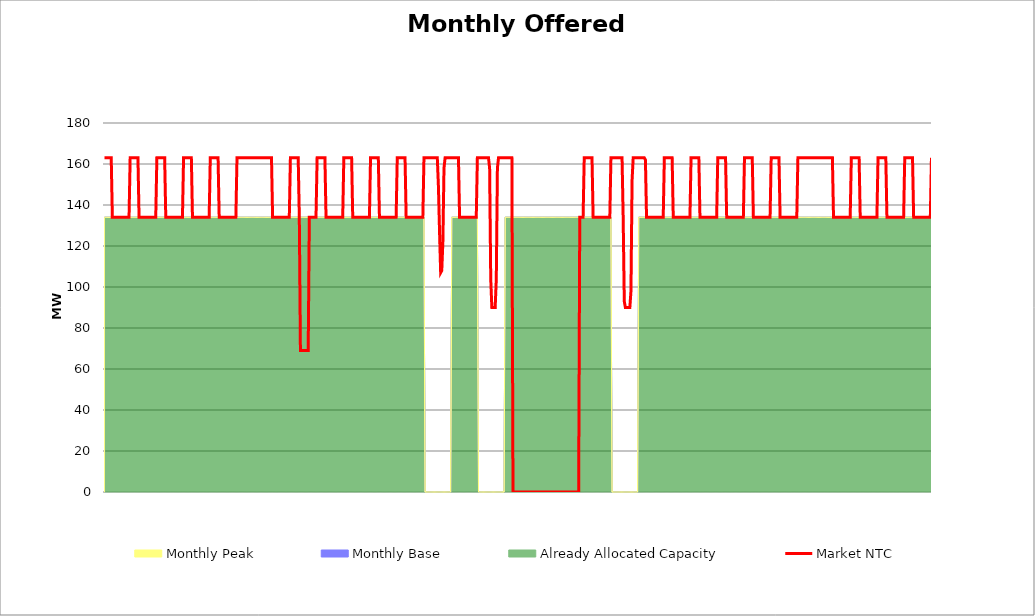
| Category | Market NTC |
|---|---|
| 0 | 163 |
| 1 | 163 |
| 2 | 163 |
| 3 | 163 |
| 4 | 163 |
| 5 | 163 |
| 6 | 163 |
| 7 | 134 |
| 8 | 134 |
| 9 | 134 |
| 10 | 134 |
| 11 | 134 |
| 12 | 134 |
| 13 | 134 |
| 14 | 134 |
| 15 | 134 |
| 16 | 134 |
| 17 | 134 |
| 18 | 134 |
| 19 | 134 |
| 20 | 134 |
| 21 | 134 |
| 22 | 134 |
| 23 | 163 |
| 24 | 163 |
| 25 | 163 |
| 26 | 163 |
| 27 | 163 |
| 28 | 163 |
| 29 | 163 |
| 30 | 163 |
| 31 | 134 |
| 32 | 134 |
| 33 | 134 |
| 34 | 134 |
| 35 | 134 |
| 36 | 134 |
| 37 | 134 |
| 38 | 134 |
| 39 | 134 |
| 40 | 134 |
| 41 | 134 |
| 42 | 134 |
| 43 | 134 |
| 44 | 134 |
| 45 | 134 |
| 46 | 134 |
| 47 | 163 |
| 48 | 163 |
| 49 | 163 |
| 50 | 163 |
| 51 | 163 |
| 52 | 163 |
| 53 | 163 |
| 54 | 163 |
| 55 | 134 |
| 56 | 134 |
| 57 | 134 |
| 58 | 134 |
| 59 | 134 |
| 60 | 134 |
| 61 | 134 |
| 62 | 134 |
| 63 | 134 |
| 64 | 134 |
| 65 | 134 |
| 66 | 134 |
| 67 | 134 |
| 68 | 134 |
| 69 | 134 |
| 70 | 134 |
| 71 | 163 |
| 72 | 163 |
| 73 | 163 |
| 74 | 163 |
| 75 | 163 |
| 76 | 163 |
| 77 | 163 |
| 78 | 163 |
| 79 | 134 |
| 80 | 134 |
| 81 | 134 |
| 82 | 134 |
| 83 | 134 |
| 84 | 134 |
| 85 | 134 |
| 86 | 134 |
| 87 | 134 |
| 88 | 134 |
| 89 | 134 |
| 90 | 134 |
| 91 | 134 |
| 92 | 134 |
| 93 | 134 |
| 94 | 134 |
| 95 | 163 |
| 96 | 163 |
| 97 | 163 |
| 98 | 163 |
| 99 | 163 |
| 100 | 163 |
| 101 | 163 |
| 102 | 163 |
| 103 | 134 |
| 104 | 134 |
| 105 | 134 |
| 106 | 134 |
| 107 | 134 |
| 108 | 134 |
| 109 | 134 |
| 110 | 134 |
| 111 | 134 |
| 112 | 134 |
| 113 | 134 |
| 114 | 134 |
| 115 | 134 |
| 116 | 134 |
| 117 | 134 |
| 118 | 134 |
| 119 | 163 |
| 120 | 163 |
| 121 | 163 |
| 122 | 163 |
| 123 | 163 |
| 124 | 163 |
| 125 | 163 |
| 126 | 163 |
| 127 | 163 |
| 128 | 163 |
| 129 | 163 |
| 130 | 163 |
| 131 | 163 |
| 132 | 163 |
| 133 | 163 |
| 134 | 163 |
| 135 | 163 |
| 136 | 163 |
| 137 | 163 |
| 138 | 163 |
| 139 | 163 |
| 140 | 163 |
| 141 | 163 |
| 142 | 163 |
| 143 | 163 |
| 144 | 163 |
| 145 | 163 |
| 146 | 163 |
| 147 | 163 |
| 148 | 163 |
| 149 | 163 |
| 150 | 163 |
| 151 | 134 |
| 152 | 134 |
| 153 | 134 |
| 154 | 134 |
| 155 | 134 |
| 156 | 134 |
| 157 | 134 |
| 158 | 134 |
| 159 | 134 |
| 160 | 134 |
| 161 | 134 |
| 162 | 134 |
| 163 | 134 |
| 164 | 134 |
| 165 | 134 |
| 166 | 134 |
| 167 | 163 |
| 168 | 163 |
| 169 | 163 |
| 170 | 163 |
| 171 | 163 |
| 172 | 163 |
| 173 | 163 |
| 174 | 163 |
| 175 | 134 |
| 176 | 69 |
| 177 | 69 |
| 178 | 69 |
| 179 | 69 |
| 180 | 69 |
| 181 | 69 |
| 182 | 69 |
| 183 | 69 |
| 184 | 134 |
| 185 | 134 |
| 186 | 134 |
| 187 | 134 |
| 188 | 134 |
| 189 | 134 |
| 190 | 134 |
| 191 | 163 |
| 192 | 163 |
| 193 | 163 |
| 194 | 163 |
| 195 | 163 |
| 196 | 163 |
| 197 | 163 |
| 198 | 163 |
| 199 | 134 |
| 200 | 134 |
| 201 | 134 |
| 202 | 134 |
| 203 | 134 |
| 204 | 134 |
| 205 | 134 |
| 206 | 134 |
| 207 | 134 |
| 208 | 134 |
| 209 | 134 |
| 210 | 134 |
| 211 | 134 |
| 212 | 134 |
| 213 | 134 |
| 214 | 134 |
| 215 | 163 |
| 216 | 163 |
| 217 | 163 |
| 218 | 163 |
| 219 | 163 |
| 220 | 163 |
| 221 | 163 |
| 222 | 163 |
| 223 | 134 |
| 224 | 134 |
| 225 | 134 |
| 226 | 134 |
| 227 | 134 |
| 228 | 134 |
| 229 | 134 |
| 230 | 134 |
| 231 | 134 |
| 232 | 134 |
| 233 | 134 |
| 234 | 134 |
| 235 | 134 |
| 236 | 134 |
| 237 | 134 |
| 238 | 134 |
| 239 | 163 |
| 240 | 163 |
| 241 | 163 |
| 242 | 163 |
| 243 | 163 |
| 244 | 163 |
| 245 | 163 |
| 246 | 163 |
| 247 | 134 |
| 248 | 134 |
| 249 | 134 |
| 250 | 134 |
| 251 | 134 |
| 252 | 134 |
| 253 | 134 |
| 254 | 134 |
| 255 | 134 |
| 256 | 134 |
| 257 | 134 |
| 258 | 134 |
| 259 | 134 |
| 260 | 134 |
| 261 | 134 |
| 262 | 134 |
| 263 | 163 |
| 264 | 163 |
| 265 | 163 |
| 266 | 163 |
| 267 | 163 |
| 268 | 163 |
| 269 | 163 |
| 270 | 163 |
| 271 | 134 |
| 272 | 134 |
| 273 | 134 |
| 274 | 134 |
| 275 | 134 |
| 276 | 134 |
| 277 | 134 |
| 278 | 134 |
| 279 | 134 |
| 280 | 134 |
| 281 | 134 |
| 282 | 134 |
| 283 | 134 |
| 284 | 134 |
| 285 | 134 |
| 286 | 134 |
| 287 | 163 |
| 288 | 163 |
| 289 | 163 |
| 290 | 163 |
| 291 | 163 |
| 292 | 163 |
| 293 | 163 |
| 294 | 163 |
| 295 | 163 |
| 296 | 163 |
| 297 | 163 |
| 298 | 163 |
| 299 | 163 |
| 300 | 149 |
| 301 | 127 |
| 302 | 107 |
| 303 | 108 |
| 304 | 122 |
| 305 | 158 |
| 306 | 163 |
| 307 | 163 |
| 308 | 163 |
| 309 | 163 |
| 310 | 163 |
| 311 | 163 |
| 312 | 163 |
| 313 | 163 |
| 314 | 163 |
| 315 | 163 |
| 316 | 163 |
| 317 | 163 |
| 318 | 163 |
| 319 | 134 |
| 320 | 134 |
| 321 | 134 |
| 322 | 134 |
| 323 | 134 |
| 324 | 134 |
| 325 | 134 |
| 326 | 134 |
| 327 | 134 |
| 328 | 134 |
| 329 | 134 |
| 330 | 134 |
| 331 | 134 |
| 332 | 134 |
| 333 | 134 |
| 334 | 134 |
| 335 | 163 |
| 336 | 163 |
| 337 | 163 |
| 338 | 163 |
| 339 | 163 |
| 340 | 163 |
| 341 | 163 |
| 342 | 163 |
| 343 | 163 |
| 344 | 163 |
| 345 | 163 |
| 346 | 158 |
| 347 | 104 |
| 348 | 90 |
| 349 | 90 |
| 350 | 90 |
| 351 | 90 |
| 352 | 104 |
| 353 | 158 |
| 354 | 163 |
| 355 | 163 |
| 356 | 163 |
| 357 | 163 |
| 358 | 163 |
| 359 | 163 |
| 360 | 163 |
| 361 | 163 |
| 362 | 163 |
| 363 | 163 |
| 364 | 163 |
| 365 | 163 |
| 366 | 163 |
| 367 | 0 |
| 368 | 0 |
| 369 | 0 |
| 370 | 0 |
| 371 | 0 |
| 372 | 0 |
| 373 | 0 |
| 374 | 0 |
| 375 | 0 |
| 376 | 0 |
| 377 | 0 |
| 378 | 0 |
| 379 | 0 |
| 380 | 0 |
| 381 | 0 |
| 382 | 0 |
| 383 | 0 |
| 384 | 0 |
| 385 | 0 |
| 386 | 0 |
| 387 | 0 |
| 388 | 0 |
| 389 | 0 |
| 390 | 0 |
| 391 | 0 |
| 392 | 0 |
| 393 | 0 |
| 394 | 0 |
| 395 | 0 |
| 396 | 0 |
| 397 | 0 |
| 398 | 0 |
| 399 | 0 |
| 400 | 0 |
| 401 | 0 |
| 402 | 0 |
| 403 | 0 |
| 404 | 0 |
| 405 | 0 |
| 406 | 0 |
| 407 | 0 |
| 408 | 0 |
| 409 | 0 |
| 410 | 0 |
| 411 | 0 |
| 412 | 0 |
| 413 | 0 |
| 414 | 0 |
| 415 | 0 |
| 416 | 0 |
| 417 | 0 |
| 418 | 0 |
| 419 | 0 |
| 420 | 0 |
| 421 | 0 |
| 422 | 0 |
| 423 | 0 |
| 424 | 0 |
| 425 | 0 |
| 426 | 0 |
| 427 | 134 |
| 428 | 134 |
| 429 | 134 |
| 430 | 134 |
| 431 | 163 |
| 432 | 163 |
| 433 | 163 |
| 434 | 163 |
| 435 | 163 |
| 436 | 163 |
| 437 | 163 |
| 438 | 163 |
| 439 | 134 |
| 440 | 134 |
| 441 | 134 |
| 442 | 134 |
| 443 | 134 |
| 444 | 134 |
| 445 | 134 |
| 446 | 134 |
| 447 | 134 |
| 448 | 134 |
| 449 | 134 |
| 450 | 134 |
| 451 | 134 |
| 452 | 134 |
| 453 | 134 |
| 454 | 134 |
| 455 | 163 |
| 456 | 163 |
| 457 | 163 |
| 458 | 163 |
| 459 | 163 |
| 460 | 163 |
| 461 | 163 |
| 462 | 163 |
| 463 | 163 |
| 464 | 163 |
| 465 | 163 |
| 466 | 134 |
| 467 | 93 |
| 468 | 90 |
| 469 | 90 |
| 470 | 90 |
| 471 | 90 |
| 472 | 90 |
| 473 | 98 |
| 474 | 152 |
| 475 | 163 |
| 476 | 163 |
| 477 | 163 |
| 478 | 163 |
| 479 | 163 |
| 480 | 163 |
| 481 | 163 |
| 482 | 163 |
| 483 | 163 |
| 484 | 163 |
| 485 | 163 |
| 486 | 162 |
| 487 | 134 |
| 488 | 134 |
| 489 | 134 |
| 490 | 134 |
| 491 | 134 |
| 492 | 134 |
| 493 | 134 |
| 494 | 134 |
| 495 | 134 |
| 496 | 134 |
| 497 | 134 |
| 498 | 134 |
| 499 | 134 |
| 500 | 134 |
| 501 | 134 |
| 502 | 134 |
| 503 | 163 |
| 504 | 163 |
| 505 | 163 |
| 506 | 163 |
| 507 | 163 |
| 508 | 163 |
| 509 | 163 |
| 510 | 163 |
| 511 | 134 |
| 512 | 134 |
| 513 | 134 |
| 514 | 134 |
| 515 | 134 |
| 516 | 134 |
| 517 | 134 |
| 518 | 134 |
| 519 | 134 |
| 520 | 134 |
| 521 | 134 |
| 522 | 134 |
| 523 | 134 |
| 524 | 134 |
| 525 | 134 |
| 526 | 134 |
| 527 | 163 |
| 528 | 163 |
| 529 | 163 |
| 530 | 163 |
| 531 | 163 |
| 532 | 163 |
| 533 | 163 |
| 534 | 163 |
| 535 | 134 |
| 536 | 134 |
| 537 | 134 |
| 538 | 134 |
| 539 | 134 |
| 540 | 134 |
| 541 | 134 |
| 542 | 134 |
| 543 | 134 |
| 544 | 134 |
| 545 | 134 |
| 546 | 134 |
| 547 | 134 |
| 548 | 134 |
| 549 | 134 |
| 550 | 134 |
| 551 | 163 |
| 552 | 163 |
| 553 | 163 |
| 554 | 163 |
| 555 | 163 |
| 556 | 163 |
| 557 | 163 |
| 558 | 163 |
| 559 | 134 |
| 560 | 134 |
| 561 | 134 |
| 562 | 134 |
| 563 | 134 |
| 564 | 134 |
| 565 | 134 |
| 566 | 134 |
| 567 | 134 |
| 568 | 134 |
| 569 | 134 |
| 570 | 134 |
| 571 | 134 |
| 572 | 134 |
| 573 | 134 |
| 574 | 134 |
| 575 | 163 |
| 576 | 163 |
| 577 | 163 |
| 578 | 163 |
| 579 | 163 |
| 580 | 163 |
| 581 | 163 |
| 582 | 163 |
| 583 | 134 |
| 584 | 134 |
| 585 | 134 |
| 586 | 134 |
| 587 | 134 |
| 588 | 134 |
| 589 | 134 |
| 590 | 134 |
| 591 | 134 |
| 592 | 134 |
| 593 | 134 |
| 594 | 134 |
| 595 | 134 |
| 596 | 134 |
| 597 | 134 |
| 598 | 134 |
| 599 | 163 |
| 600 | 163 |
| 601 | 163 |
| 602 | 163 |
| 603 | 163 |
| 604 | 163 |
| 605 | 163 |
| 606 | 163 |
| 607 | 134 |
| 608 | 134 |
| 609 | 134 |
| 610 | 134 |
| 611 | 134 |
| 612 | 134 |
| 613 | 134 |
| 614 | 134 |
| 615 | 134 |
| 616 | 134 |
| 617 | 134 |
| 618 | 134 |
| 619 | 134 |
| 620 | 134 |
| 621 | 134 |
| 622 | 134 |
| 623 | 163 |
| 624 | 163 |
| 625 | 163 |
| 626 | 163 |
| 627 | 163 |
| 628 | 163 |
| 629 | 163 |
| 630 | 163 |
| 631 | 163 |
| 632 | 163 |
| 633 | 163 |
| 634 | 163 |
| 635 | 163 |
| 636 | 163 |
| 637 | 163 |
| 638 | 163 |
| 639 | 163 |
| 640 | 163 |
| 641 | 163 |
| 642 | 163 |
| 643 | 163 |
| 644 | 163 |
| 645 | 163 |
| 646 | 163 |
| 647 | 163 |
| 648 | 163 |
| 649 | 163 |
| 650 | 163 |
| 651 | 163 |
| 652 | 163 |
| 653 | 163 |
| 654 | 163 |
| 655 | 134 |
| 656 | 134 |
| 657 | 134 |
| 658 | 134 |
| 659 | 134 |
| 660 | 134 |
| 661 | 134 |
| 662 | 134 |
| 663 | 134 |
| 664 | 134 |
| 665 | 134 |
| 666 | 134 |
| 667 | 134 |
| 668 | 134 |
| 669 | 134 |
| 670 | 134 |
| 671 | 163 |
| 672 | 163 |
| 673 | 163 |
| 674 | 163 |
| 675 | 163 |
| 676 | 163 |
| 677 | 163 |
| 678 | 163 |
| 679 | 134 |
| 680 | 134 |
| 681 | 134 |
| 682 | 134 |
| 683 | 134 |
| 684 | 134 |
| 685 | 134 |
| 686 | 134 |
| 687 | 134 |
| 688 | 134 |
| 689 | 134 |
| 690 | 134 |
| 691 | 134 |
| 692 | 134 |
| 693 | 134 |
| 694 | 134 |
| 695 | 163 |
| 696 | 163 |
| 697 | 163 |
| 698 | 163 |
| 699 | 163 |
| 700 | 163 |
| 701 | 163 |
| 702 | 163 |
| 703 | 134 |
| 704 | 134 |
| 705 | 134 |
| 706 | 134 |
| 707 | 134 |
| 708 | 134 |
| 709 | 134 |
| 710 | 134 |
| 711 | 134 |
| 712 | 134 |
| 713 | 134 |
| 714 | 134 |
| 715 | 134 |
| 716 | 134 |
| 717 | 134 |
| 718 | 134 |
| 719 | 163 |
| 720 | 163 |
| 721 | 163 |
| 722 | 163 |
| 723 | 163 |
| 724 | 163 |
| 725 | 163 |
| 726 | 163 |
| 727 | 134 |
| 728 | 134 |
| 729 | 134 |
| 730 | 134 |
| 731 | 134 |
| 732 | 134 |
| 733 | 134 |
| 734 | 134 |
| 735 | 134 |
| 736 | 134 |
| 737 | 134 |
| 738 | 134 |
| 739 | 134 |
| 740 | 134 |
| 741 | 134 |
| 742 | 134 |
| 743 | 163 |